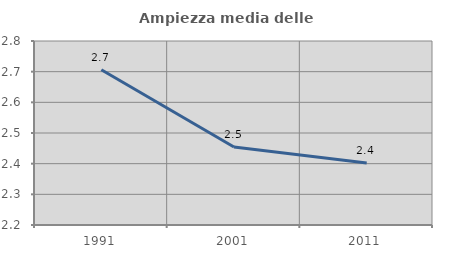
| Category | Ampiezza media delle famiglie |
|---|---|
| 1991.0 | 2.706 |
| 2001.0 | 2.455 |
| 2011.0 | 2.402 |